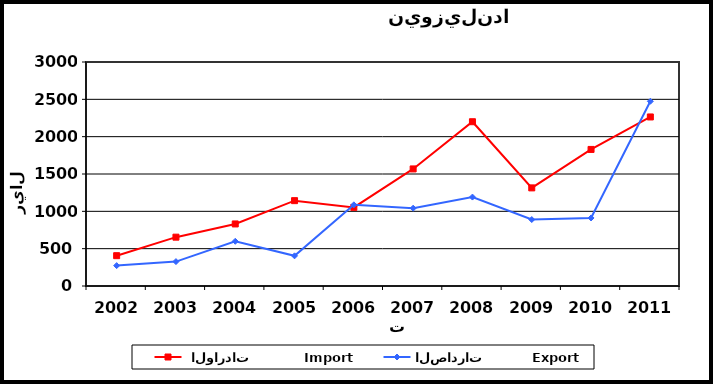
| Category |  الواردات           Import | الصادرات          Export |
|---|---|---|
| 2002.0 | 406 | 273 |
| 2003.0 | 654 | 327 |
| 2004.0 | 831 | 599 |
| 2005.0 | 1143 | 404 |
| 2006.0 | 1053 | 1087 |
| 2007.0 | 1568 | 1042 |
| 2008.0 | 2200 | 1191 |
| 2009.0 | 1314 | 890 |
| 2010.0 | 1829 | 911 |
| 2011.0 | 2264 | 2474 |